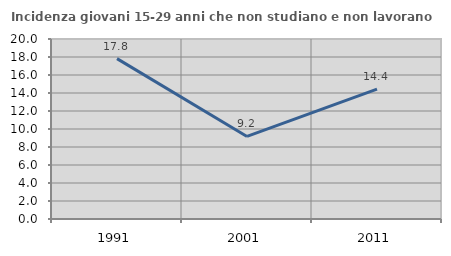
| Category | Incidenza giovani 15-29 anni che non studiano e non lavorano  |
|---|---|
| 1991.0 | 17.822 |
| 2001.0 | 9.176 |
| 2011.0 | 14.431 |